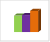
| Category | област Монтана |
|---|---|
| летен сезон 2019  | 32035 |
| летен сезон 2021  | 33058 |
| летен сезон 2022 г.  | 41177 |